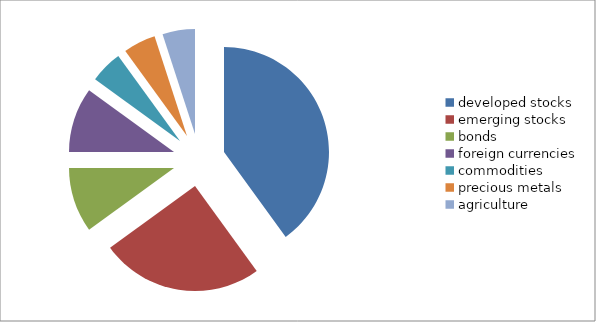
| Category | Series 0 |
|---|---|
| developed stocks | 0.4 |
| emerging stocks | 0.25 |
| bonds | 0.1 |
| foreign currencies | 0.1 |
| commodities | 0.05 |
| precious metals | 0.05 |
| agriculture | 0.05 |